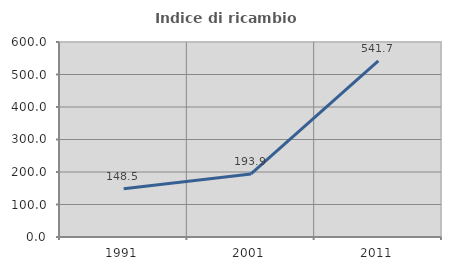
| Category | Indice di ricambio occupazionale  |
|---|---|
| 1991.0 | 148.485 |
| 2001.0 | 193.939 |
| 2011.0 | 541.667 |